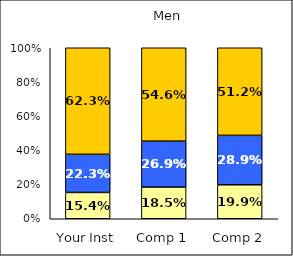
| Category | Low Habits of Mind | Average Habits of Mind | High Habits of Mind |
|---|---|---|---|
| Your Inst | 0.154 | 0.223 | 0.623 |
| Comp 1 | 0.185 | 0.269 | 0.546 |
| Comp 2 | 0.199 | 0.289 | 0.512 |